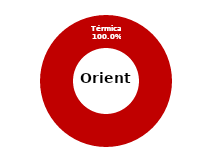
| Category | Oriente |
|---|---|
| Eólica | 0 |
| Hidráulica | 0 |
| Solar | 0 |
| Térmica | 34.561 |